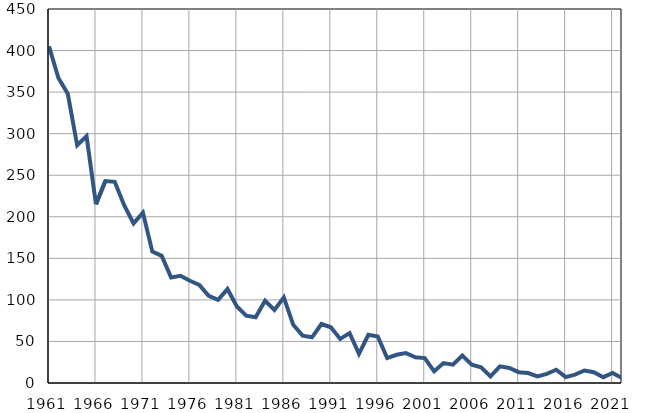
| Category | Умрла 
одојчад |
|---|---|
| 1961.0 | 405 |
| 1962.0 | 367 |
| 1963.0 | 348 |
| 1964.0 | 286 |
| 1965.0 | 297 |
| 1966.0 | 215 |
| 1967.0 | 243 |
| 1968.0 | 242 |
| 1969.0 | 214 |
| 1970.0 | 192 |
| 1971.0 | 205 |
| 1972.0 | 158 |
| 1973.0 | 153 |
| 1974.0 | 127 |
| 1975.0 | 129 |
| 1976.0 | 123 |
| 1977.0 | 118 |
| 1978.0 | 105 |
| 1979.0 | 100 |
| 1980.0 | 113 |
| 1981.0 | 92 |
| 1982.0 | 81 |
| 1983.0 | 79 |
| 1984.0 | 99 |
| 1985.0 | 88 |
| 1986.0 | 103 |
| 1987.0 | 70 |
| 1988.0 | 57 |
| 1989.0 | 55 |
| 1990.0 | 71 |
| 1991.0 | 67 |
| 1992.0 | 53 |
| 1993.0 | 60 |
| 1994.0 | 35 |
| 1995.0 | 58 |
| 1996.0 | 56 |
| 1997.0 | 30 |
| 1998.0 | 34 |
| 1999.0 | 36 |
| 2000.0 | 31 |
| 2001.0 | 30 |
| 2002.0 | 14 |
| 2003.0 | 24 |
| 2004.0 | 22 |
| 2005.0 | 33 |
| 2006.0 | 22 |
| 2007.0 | 19 |
| 2008.0 | 8 |
| 2009.0 | 20 |
| 2010.0 | 18 |
| 2011.0 | 13 |
| 2012.0 | 12 |
| 2013.0 | 8 |
| 2014.0 | 11 |
| 2015.0 | 16 |
| 2016.0 | 7 |
| 2017.0 | 10 |
| 2018.0 | 15 |
| 2019.0 | 13 |
| 2020.0 | 7 |
| 2021.0 | 12 |
| 2022.0 | 6 |